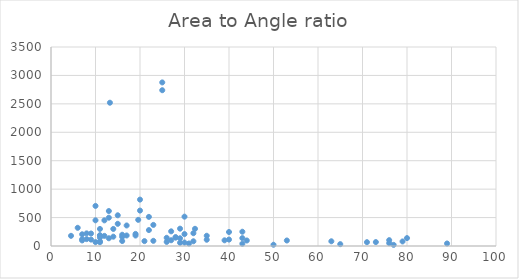
| Category | Series 0 |
|---|---|
| 13.24 | 2520 |
| 32.36 | 302.3 |
| 16.0 | 197.7 |
| 4.5 | 179 |
| 30.0 | 516 |
| 19.6 | 460 |
| 7.0 | 206 |
| 7.0 | 120 |
| 65.0 | 32.4 |
| 16.0 | 160 |
| 43.0 | 251 |
| 30.0 | 210 |
| 25.0 | 2877 |
| 40.0 | 113 |
| 63.0 | 83 |
| 71.0 | 67 |
| 25.0 | 2740 |
| 8.0 | 222 |
| 89.0 | 44 |
| 40.0 | 246 |
| 11.0 | 66 |
| 11.0 | 83 |
| 32.0 | 225 |
| 22.0 | 280 |
| 21.0 | 86 |
| 14.0 | 164 |
| 29.0 | 136 |
| 26.0 | 72 |
| 23.0 | 371 |
| 29.0 | 57 |
| 23.0 | 91 |
| 17.0 | 185 |
| 44.0 | 97 |
| 12.0 | 451 |
| 11.0 | 300 |
| 76.0 | 103 |
| 11.0 | 190 |
| 15.0 | 540 |
| 14.0 | 300 |
| 10.0 | 69 |
| 35.0 | 110 |
| 50.0 | 22 |
| 77.0 | 20 |
| 19.0 | 184 |
| 28.0 | 147 |
| 26.0 | 144 |
| 16.0 | 87 |
| 32.0 | 83 |
| 76.0 | 50 |
| 6.0 | 320 |
| 10.0 | 452 |
| 9.0 | 220 |
| 27.0 | 258 |
| 73.0 | 69 |
| 9.0 | 113 |
| 13.0 | 136 |
| 43.0 | 139 |
| 20.0 | 623 |
| 19.0 | 213 |
| 8.0 | 121 |
| 31.0 | 44 |
| 13.0 | 615 |
| 35.0 | 180 |
| 30.0 | 61 |
| 7.0 | 98 |
| 22.0 | 512 |
| 20.0 | 816 |
| 29.0 | 305 |
| 10.0 | 705 |
| 11.0 | 182 |
| 11.0 | 147 |
| 13.0 | 498 |
| 43.0 | 40 |
| 79.0 | 80 |
| 28.0 | 156 |
| 27.0 | 101 |
| 53.0 | 97 |
| 80.0 | 139 |
| 15.0 | 390 |
| 39.0 | 100 |
| 17.0 | 361 |
| 12.0 | 178 |